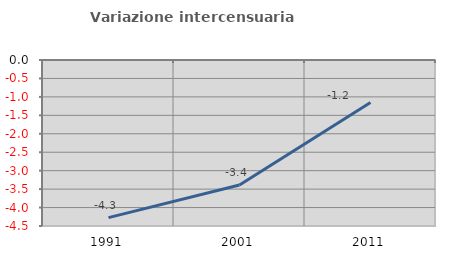
| Category | Variazione intercensuaria annua |
|---|---|
| 1991.0 | -4.273 |
| 2001.0 | -3.39 |
| 2011.0 | -1.15 |